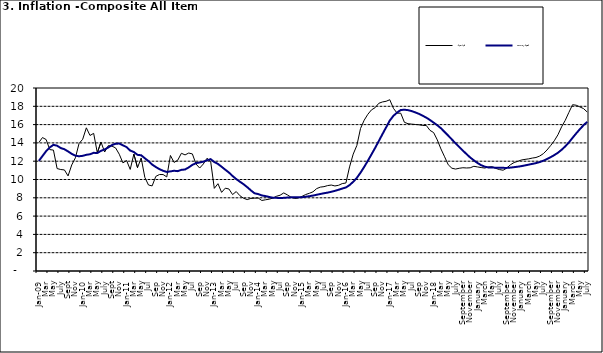
| Category | Year-on Rate | 12-Month Average |
|---|---|---|
| Jan-09 | 14.034 | 12.032 |
| Feb | 14.584 | 12.567 |
| Mar | 14.366 | 13.101 |
| Apr | 13.268 | 13.51 |
| May | 13.212 | 13.787 |
| June | 11.194 | 13.694 |
| July | 11.09 | 13.437 |
| Aug | 11.046 | 13.307 |
| Sept | 10.39 | 13.065 |
| Oct | 11.588 | 12.803 |
| Nov | 12.368 | 12.609 |
| Dec | 13.93 | 12.538 |
| Jan-10 | 14.398 | 12.586 |
| Feb | 15.649 | 12.7 |
| Mar | 14.812 | 12.757 |
| Apr | 15.044 | 12.915 |
| May | 12.915 | 12.893 |
| June | 14.099 | 13.132 |
| July | 13.002 | 13.284 |
| Aug | 13.702 | 13.5 |
| Sept | 13.65 | 13.764 |
| Oct | 13.45 | 13.908 |
| Nov | 12.766 | 13.928 |
| Dec | 11.815 | 13.74 |
| Jan-11 | 12.08 | 13.542 |
| Feb | 11.1 | 13.161 |
| Mar | 12.779 | 13.001 |
| Apr | 11.291 | 12.694 |
| May | 12.352 | 12.648 |
| Jun | 10.23 | 12.321 |
| Jul | 9.397 | 12.009 |
| Aug | 9.301 | 11.635 |
| Sep | 10.339 | 11.363 |
| Oct | 10.544 | 11.13 |
| Nov | 10.54 | 10.952 |
| Dec | 10.283 | 10.826 |
| Jan-12 | 12.626 | 10.886 |
| Feb | 11.866 | 10.955 |
| Mar | 12.111 | 10.914 |
| Apr | 12.866 | 11.054 |
| May | 12.688 | 11.096 |
| Jun | 12.892 | 11.32 |
| Jul | 12.797 | 11.599 |
| Aug | 11.689 | 11.791 |
| Sep | 11.253 | 11.859 |
| Oct | 11.693 | 11.948 |
| Nov | 12.32 | 12.091 |
| Dec | 11.981 | 12.224 |
| Jan-13 | 9.031 | 11.908 |
| Feb | 9.542 | 11.703 |
| Mar | 8.593 | 11.394 |
| Apr | 9.052 | 11.072 |
| May | 8.964 | 10.761 |
| Jun | 8.353 | 10.383 |
| Jul | 8.682 | 10.047 |
| Aug | 8.231 | 9.761 |
| Sep | 7.952 | 9.486 |
| Oct | 7.807 | 9.167 |
| Nov | 7.931 | 8.815 |
| Dec | 7.957 | 8.496 |
| Jan-14 | 7.977 | 8.408 |
| Feb | 7.707 | 8.257 |
| Mar | 7.783 | 8.19 |
| Apr | 7.851 | 8.092 |
| May | 7.965 | 8.012 |
| Jun | 8.167 | 7.998 |
| Jul | 8.281 | 7.968 |
| Aug | 8.534 | 7.996 |
| Sep | 8.317 | 8.027 |
| Oct | 8.06 | 8.047 |
| Nov | 7.927 | 8.046 |
| Dec | 7.978 | 8.047 |
| Jan-15 | 8.157 | 8.063 |
| Feb | 8.359 | 8.117 |
| Mar | 8.494 | 8.176 |
| Apr | 8.655 | 8.243 |
| May | 9.003 | 8.331 |
| Jun | 9.168 | 8.417 |
| Jul | 9.218 | 8.497 |
| Aug | 9.336 | 8.566 |
| Sep | 9.394 | 8.658 |
| Oct | 9.296 | 8.76 |
| Nov | 9.368 | 8.879 |
| Dec | 9.554 | 9.009 |
| Jan-16 | 9.617 | 9.13 |
| Feb | 11.379 | 9.386 |
| Mar | 12.775 | 9.751 |
| Apr | 13.721 | 10.182 |
| May | 15.577 | 10.746 |
| Jun | 16.48 | 11.372 |
| Jul | 17.127 | 12.045 |
| Aug | 17.609 | 12.744 |
| Sep | 17.852 | 13.454 |
| Oct | 18.33 | 14.206 |
| Nov | 18.476 | 14.958 |
| Dec | 18.547 | 15.697 |
| Jan-17 | 18.719 | 16.441 |
| Feb | 17.78 | 16.958 |
| Mar | 17.256 | 17.315 |
| Apr | 17.244 | 17.591 |
| May | 16.251 | 17.628 |
| Jun | 16.098 | 17.578 |
| Jul | 16.053 | 17.475 |
| Aug | 16.012 | 17.331 |
| Sep | 15.979 | 17.17 |
| Oct | 15.905 | 16.968 |
| Nov | 15.901 | 16.76 |
| Dec | 15.372 | 16.502 |
| Jan-18 | 15.127 | 16.215 |
| Feb | 14.33 | 15.93 |
| Mar | 13.337 | 15.599 |
| Apr | 12.482 | 15.196 |
| May | 11.608 | 14.793 |
| June | 11.231 | 14.371 |
| July | 11.142 | 13.95 |
| August | 11.227 | 13.546 |
| September | 11.284 | 13.157 |
| October | 11.259 | 12.777 |
| November | 11.281 | 12.406 |
| December | 11.442 | 12.095 |
| January | 11.374 | 11.801 |
| February | 11.306 | 11.564 |
| March | 11.251 | 11.401 |
| April | 11.372 | 11.314 |
| May | 11.396 | 11.299 |
| June | 11.217 | 11.297 |
| July | 11.084 | 11.291 |
| August | 11.016 | 11.271 |
| September | 11.244 | 11.268 |
| October | 11.607 | 11.298 |
| November | 11.854 | 11.348 |
| December | 11.982 | 11.396 |
| January | 12.132 | 11.462 |
| February | 12.199 | 11.539 |
| March | 12.257 | 11.624 |
| April | 12.341 | 11.706 |
| May | 12.404 | 11.791 |
| June | 12.559 | 11.904 |
| July | 12.821 | 12.049 |
| August | 13.22 | 12.233 |
| September | 13.707 | 12.44 |
| October | 14.233 | 12.664 |
| November | 14.887 | 12.923 |
| December | 15.753 | 13.246 |
| January | 16.466 | 13.616 |
| February | 17.335 | 14.053 |
| March | 18.171 | 14.554 |
| April | 18.117 | 15.039 |
| May | 17.933 | 15.499 |
| June | 17.751 | 15.927 |
| July | 17.377 | 16.298 |